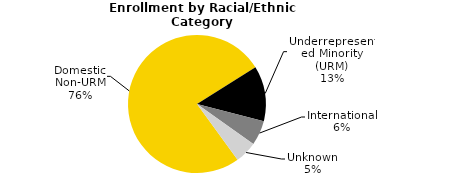
| Category | Series 0 |
|---|---|
| Domestic Non-URM | 23927 |
| Underrepresented Minority (URM) | 4077 |
| International | 1815 |
| Unknown | 1633 |